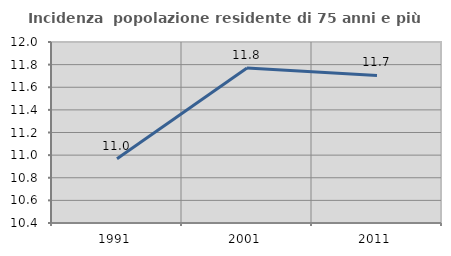
| Category | Incidenza  popolazione residente di 75 anni e più |
|---|---|
| 1991.0 | 10.967 |
| 2001.0 | 11.77 |
| 2011.0 | 11.705 |